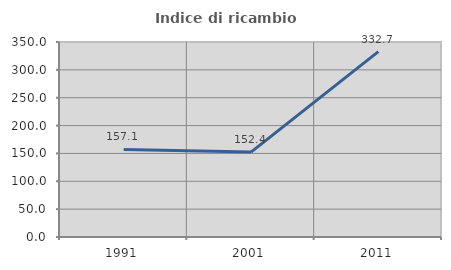
| Category | Indice di ricambio occupazionale  |
|---|---|
| 1991.0 | 157.143 |
| 2001.0 | 152.381 |
| 2011.0 | 332.727 |